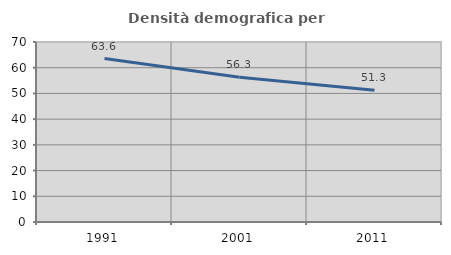
| Category | Densità demografica |
|---|---|
| 1991.0 | 63.554 |
| 2001.0 | 56.313 |
| 2011.0 | 51.272 |